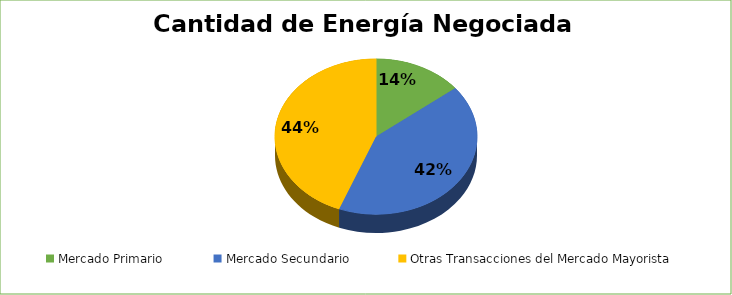
| Category | Series 0 |
|---|---|
| Mercado Primario | 2241066 |
| Mercado Secundario | 6526346 |
| Otras Transacciones del Mercado Mayorista | 6909704 |